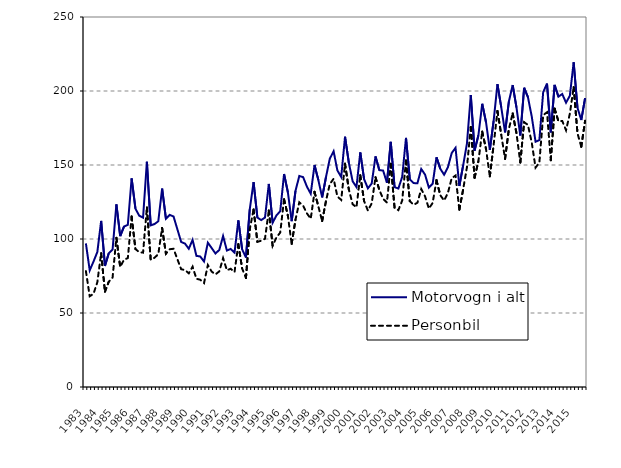
| Category | Motorvogn i alt | Personbil |
|---|---|---|
| 1983.0 | 97 | 78.3 |
| nan | 78.8 | 61.3 |
| nan | 84.8 | 63 |
| nan | 91.2 | 70.8 |
| 1984.0 | 112.2 | 90.4 |
| nan | 81.8 | 64.4 |
| nan | 90.4 | 71.1 |
| nan | 92.9 | 73.9 |
| 1985.0 | 123.4 | 100.8 |
| nan | 102 | 81.1 |
| nan | 108.4 | 86 |
| nan | 109.6 | 87.1 |
| 1986.0 | 141 | 115.2 |
| nan | 120.5 | 93.2 |
| nan | 115.7 | 91.1 |
| nan | 114.4 | 90.8 |
| 1987.0 | 152.2 | 121.3 |
| nan | 109.2 | 86.1 |
| nan | 110.1 | 87.3 |
| nan | 112 | 89.8 |
| 1988.0 | 134.1 | 107.5 |
| nan | 113.7 | 90 |
| nan | 116.3 | 93.1 |
| nan | 115.2 | 93.4 |
| 1989.0 | 106.6 | 86.4 |
| nan | 98 | 79.6 |
| nan | 96.9 | 79 |
| nan | 93.4 | 76.8 |
| 1990.0 | 99.4 | 81.3 |
| nan | 88.6 | 73.1 |
| nan | 88.2 | 72.5 |
| nan | 84.8 | 70.2 |
| 1991.0 | 97.5 | 82.4 |
| nan | 93.9 | 78 |
| nan | 90.2 | 76.1 |
| nan | 92.6 | 78.1 |
| 1992.0 | 102 | 87.1 |
| nan | 92.2 | 78.9 |
| nan | 93.3 | 79.9 |
| nan | 90.8 | 77.6 |
| 1993.0 | 112.6 | 96.5 |
| nan | 93 | 80.1 |
| nan | 87.5 | 73.6 |
| nan | 120.1 | 106.6 |
| 1994.0 | 138.4 | 120 |
| nan | 114.5 | 98.1 |
| nan | 112.8 | 98.8 |
| nan | 114.5 | 100.2 |
| 1995.0 | 137.2 | 119.3 |
| nan | 111 | 95.4 |
| nan | 115.9 | 101 |
| nan | 118.8 | 104.4 |
| 1996.0 | 143.9 | 126.9 |
| nan | 131.6 | 115.7 |
| nan | 112 | 96.7 |
| nan | 132.5 | 113.1 |
| 1997.0 | 142.6 | 124.8 |
| nan | 141.8 | 122.5 |
| nan | 135.4 | 117.3 |
| nan | 130.6 | 113.7 |
| 1998.0 | 150 | 131.9 |
| nan | 139.8 | 122 |
| nan | 128.1 | 112.1 |
| nan | 141.8 | 125.6 |
| 1999.0 | 154.2 | 137.1 |
| nan | 159.3 | 140.7 |
| nan | 146.3 | 128.7 |
| nan | 141.9 | 126.4 |
| 2000.0 | 169.1 | 150.9 |
| nan | 151.5 | 133.4 |
| nan | 139 | 123.5 |
| nan | 135.1 | 121.4 |
| 2001.0 | 158.5 | 143.1 |
| nan | 140.46 | 125.7 |
| nan | 134.24 | 119.2 |
| nan | 137.495 | 124.072 |
| 2002.0 | 155.814 | 141.724 |
| nan | 146.543 | 133.19 |
| nan | 146.231 | 127.141 |
| nan | 137.967 | 124.641 |
| 2003.0 | 165.679 | 150.811 |
| nan | 135.021 | 121.101 |
| nan | 134.111 | 119.491 |
| nan | 142.013 | 125.959 |
| 2004.0 | 168.309 | 153.043 |
| nan | 140.267 | 125.568 |
| nan | 137.77 | 123.121 |
| nan | 137.685 | 124.506 |
| 2005.0 | 147.311 | 133.756 |
| nan | 143.517 | 128.79 |
| nan | 134.783 | 120.571 |
| nan | 137.37 | 124.382 |
| 2006.0 | 155.213 | 139.728 |
| nan | 147.444 | 129.572 |
| nan | 143.451 | 126.006 |
| nan | 148.561 | 131.195 |
| 2007.0 | 158.1 | 141.084 |
| nan | 161.613 | 142.897 |
| nan | 135.821 | 119.753 |
| nan | 149.791 | 133.498 |
| 2008.0 | 164.642 | 148.614 |
| nan | 197.287 | 175.714 |
| nan | 159.718 | 141.407 |
| nan | 170.057 | 152.54 |
| 2009.0 | 191.38 | 172.559 |
| nan | 178.906 | 160.765 |
| nan | 160.234 | 142.312 |
| nan | 179.857 | 163.532 |
| 2010.0 | 204.636 | 186.507 |
| nan | 188.957 | 170.463 |
| nan | 172.077 | 154.156 |
| nan | 192.961 | 174.399 |
| 2011.0 | 204.005 | 184.86 |
| nan | 188.741 | 171.333 |
| nan | 169.934 | 151.694 |
| nan | 202.176 | 178.919 |
| 2012.0 | 195.829 | 177.072 |
| nan | 182.751 | 165.128 |
| nan | 165.73 | 148.242 |
| nan | 166.805 | 151.728 |
| 2013.0 | 199.181 | 183.653 |
| nan | 205.015 | 185.634 |
| nan | 172.044 | 153.21 |
| nan | 204.1 | 188.079 |
| 2014.0 | 196.177 | 179.552 |
| nan | 197.965 | 179.767 |
| nan | 192.105 | 173.474 |
| nan | 196.809 | 184.739 |
| 2015.0 | 219.419 | 202.592 |
| nan | 188.696 | 171.451 |
| nan | 180.388 | 162.297 |
| nan | 195.23 | 179.891 |